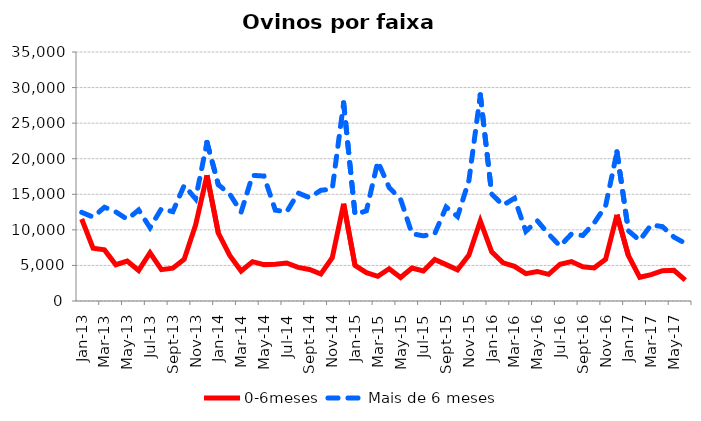
| Category | 0-6meses | Mais de 6 meses |
|---|---|---|
| 2013-01-01 | 11530 | 12463 |
| 2013-02-01 | 7414 | 11796 |
| 2013-03-01 | 7187 | 13178 |
| 2013-04-01 | 5101 | 12519 |
| 2013-05-01 | 5621 | 11492 |
| 2013-06-01 | 4294 | 12798 |
| 2013-07-01 | 6780 | 10308 |
| 2013-08-01 | 4403 | 12975 |
| 2013-09-01 | 4617 | 12554 |
| 2013-10-01 | 5856 | 16249 |
| 2013-11-01 | 10669 | 14361 |
| 2013-12-01 | 17662 | 22293 |
| 2014-01-01 | 9530 | 16343 |
| 2014-02-01 | 6416 | 15027 |
| 2014-03-01 | 4210 | 12495 |
| 2014-04-01 | 5526 | 17659 |
| 2014-05-01 | 5114 | 17564 |
| 2014-06-01 | 5154 | 12769 |
| 2014-07-01 | 5341 | 12515 |
| 2014-08-01 | 4722 | 15190 |
| 2014-09-01 | 4425 | 14519 |
| 2014-10-01 | 3796 | 15562 |
| 2014-11-01 | 6092 | 15732 |
| 2014-12-01 | 13659 | 27848 |
| 2015-01-01 | 5005 | 12160 |
| 2015-02-01 | 3981 | 12674 |
| 2015-03-01 | 3471 | 19598 |
| 2015-04-01 | 4536 | 15953 |
| 2015-05-01 | 3304 | 14302 |
| 2015-06-01 | 4629 | 9462 |
| 2015-07-01 | 4232 | 9160 |
| 2015-08-01 | 5834 | 9455 |
| 2015-09-01 | 5114 | 13210 |
| 2015-10-01 | 4381 | 11872 |
| 2015-11-01 | 6471 | 16936 |
| 2015-12-01 | 11254 | 28973 |
| 2016-01-01 | 6897 | 15037 |
| 2016-02-01 | 5368 | 13456 |
| 2016-03-01 | 4864 | 14442 |
| 2016-04-01 | 3842 | 9795 |
| 2016-05-01 | 4155 | 11288 |
| 2016-06-01 | 3753 | 9405 |
| 2016-07-01 | 5168 | 7726 |
| 2016-08-01 | 5545 | 9412 |
| 2016-09-01 | 4801 | 9215 |
| 2016-10-01 | 4657 | 10970 |
| 2016-11-01 | 5854 | 13349 |
| 2016-12-01 | 12120 | 20961 |
| 2017-01-01 | 6396 | 9871 |
| 2017-02-01 | 3331 | 8517 |
| 2017-03-01 | 3706 | 10714 |
| 2017-04-01 | 4256 | 10447 |
| 2017-05-01 | 4319 | 8979 |
| 2017-06-01 | 2930 | 8108 |